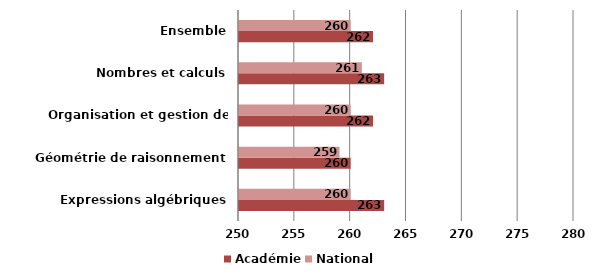
| Category | Académie | National |
|---|---|---|
| Expressions algébriques | 263 | 260 |
| Géométrie de raisonnement | 260 | 259 |
| Organisation et gestion de données | 262 | 260 |
| Nombres et calculs | 263 | 261 |
| Ensemble | 262 | 260 |